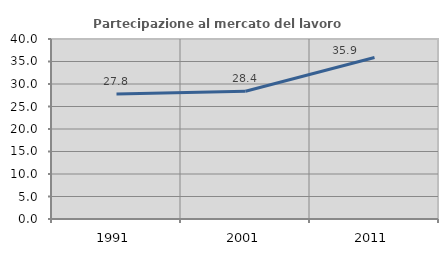
| Category | Partecipazione al mercato del lavoro  femminile |
|---|---|
| 1991.0 | 27.755 |
| 2001.0 | 28.4 |
| 2011.0 | 35.886 |